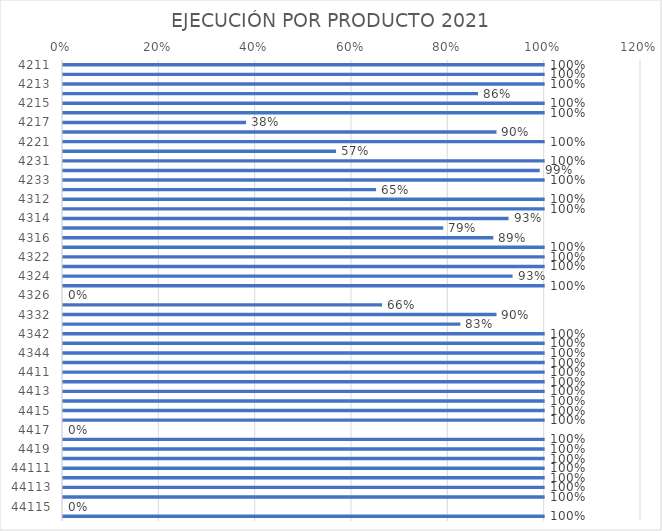
| Category | Series 0 |
|---|---|
| 4211.0 | 1 |
| 4212.0 | 1 |
| 4213.0 | 1 |
| 4214.0 | 0.862 |
| 4215.0 | 1 |
| 4216.0 | 1 |
| 4217.0 | 0.38 |
| 4218.0 | 0.9 |
| 4221.0 | 1 |
| 4222.0 | 0.567 |
| 4231.0 | 1 |
| 4232.0 | 0.99 |
| 4233.0 | 1 |
| 4311.0 | 0.65 |
| 4312.0 | 1 |
| 4313.0 | 1 |
| 4314.0 | 0.925 |
| 4315.0 | 0.789 |
| 4316.0 | 0.893 |
| 4321.0 | 1 |
| 4322.0 | 1 |
| 4323.0 | 1 |
| 4324.0 | 0.933 |
| 4325.0 | 1 |
| 4326.0 | 0 |
| 4331.0 | 0.662 |
| 4332.0 | 0.9 |
| 4341.0 | 0.825 |
| 4342.0 | 1 |
| 4343.0 | 1 |
| 4344.0 | 1 |
| 4345.0 | 1 |
| 4411.0 | 1 |
| 4412.0 | 1 |
| 4413.0 | 1 |
| 4414.0 | 1 |
| 4415.0 | 1 |
| 4416.0 | 1 |
| 4417.0 | 0 |
| 4418.0 | 1 |
| 4419.0 | 1 |
| 44110.0 | 1 |
| 44111.0 | 1 |
| 44112.0 | 1 |
| 44113.0 | 1 |
| 44114.0 | 1 |
| 44115.0 | 0 |
| 44116.0 | 1 |